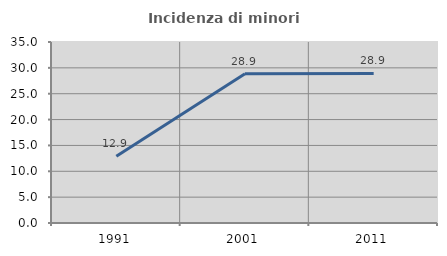
| Category | Incidenza di minori stranieri |
|---|---|
| 1991.0 | 12.903 |
| 2001.0 | 28.859 |
| 2011.0 | 28.916 |